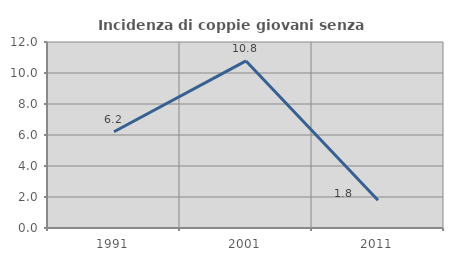
| Category | Incidenza di coppie giovani senza figli |
|---|---|
| 1991.0 | 6.207 |
| 2001.0 | 10.778 |
| 2011.0 | 1.786 |